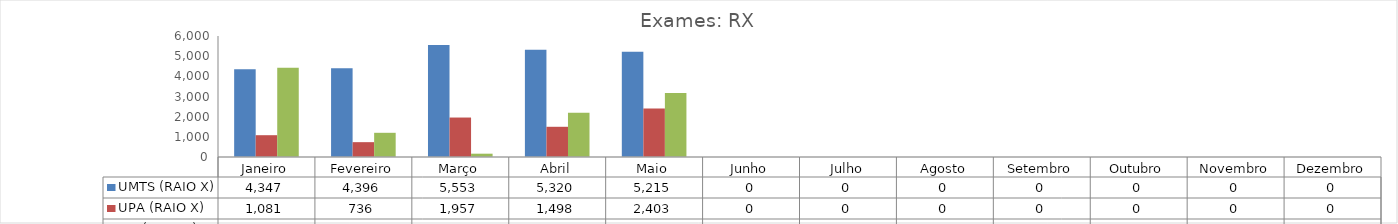
| Category | UMTS (RAIO X) | UPA (RAIO X) | PIS (RAIO X) |
|---|---|---|---|
| Janeiro | 4347 | 1081 | 4422 |
| Fevereiro | 4396 | 736 | 1200 |
| Março | 5553 | 1957 | 164 |
| Abril | 5320 | 1498 | 2189 |
| Maio | 5215 | 2403 | 3173 |
| Junho | 0 | 0 | 0 |
| Julho | 0 | 0 | 0 |
| Agosto | 0 | 0 | 0 |
| Setembro | 0 | 0 | 0 |
| Outubro | 0 | 0 | 0 |
| Novembro | 0 | 0 | 0 |
| Dezembro | 0 | 0 | 0 |